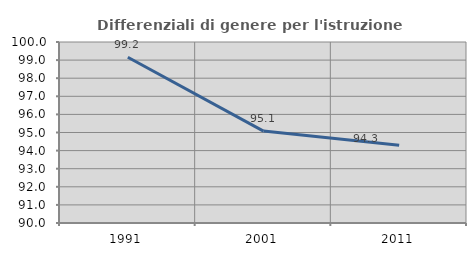
| Category | Differenziali di genere per l'istruzione superiore |
|---|---|
| 1991.0 | 99.155 |
| 2001.0 | 95.077 |
| 2011.0 | 94.29 |